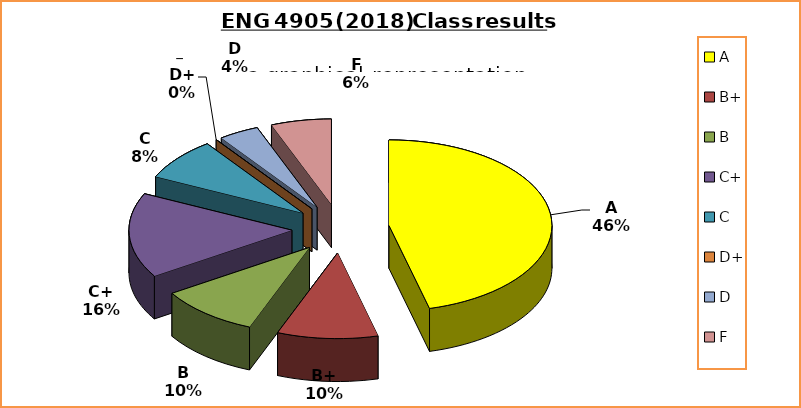
| Category | Series 0 |
|---|---|
| A | 23 |
| B+ | 5 |
| B | 5 |
| C+ | 8 |
| C | 4 |
| D+ | 0 |
| D | 2 |
| F | 3 |